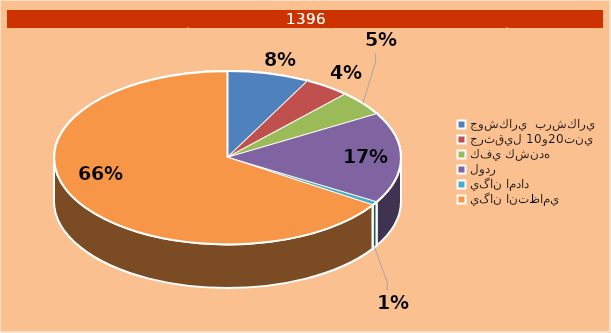
| Category | Series 0 |
|---|---|
| جوشكاري  برشكاري  | 56 |
| جرثقيل 10و20تني  | 31 |
| كفي كشنده  | 34 |
| لودر | 124 |
| يگان امداد | 5 |
| يگان انتظامي  | 480 |